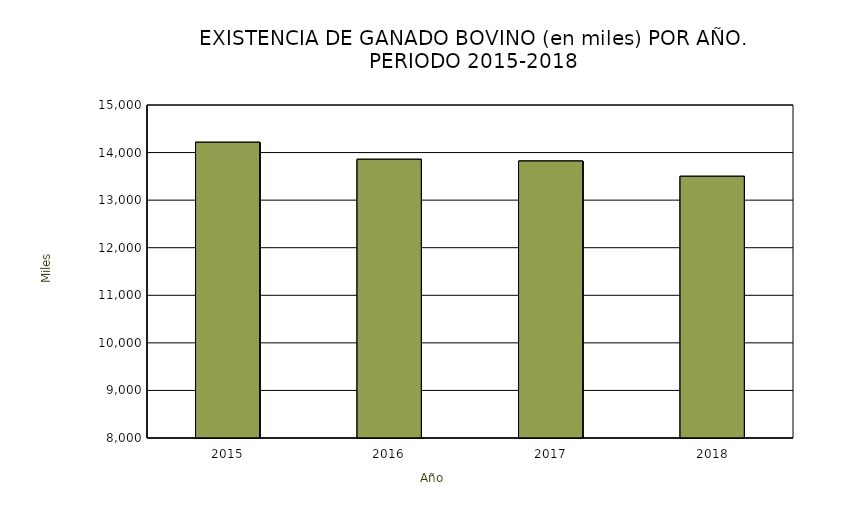
| Category | Series 0 |
|---|---|
| 2015.0 | 14216.2 |
| 2016.0 | 13858.584 |
| 2017.0 | 13821.526 |
| 2018.0 | 13500.965 |